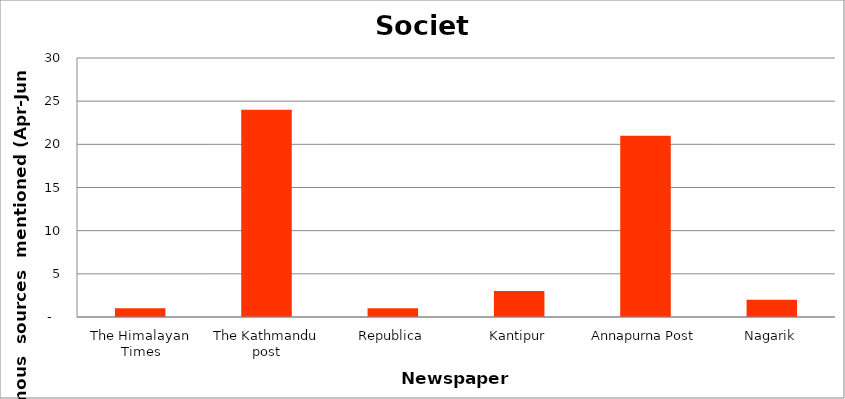
| Category | Society |
|---|---|
| The Himalayan Times | 1 |
| The Kathmandu post | 24 |
| Republica | 1 |
| Kantipur | 3 |
| Annapurna Post | 21 |
| Nagarik | 2 |